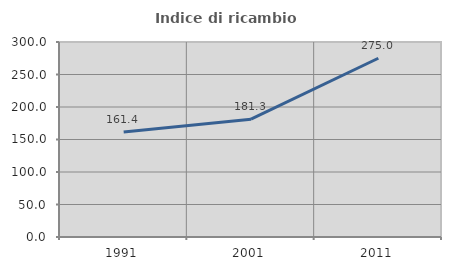
| Category | Indice di ricambio occupazionale  |
|---|---|
| 1991.0 | 161.404 |
| 2001.0 | 181.25 |
| 2011.0 | 275 |